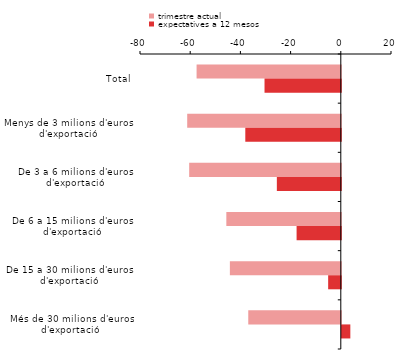
| Category | trimestre actual | expectatives a 12 mesos |
|---|---|---|
| Total | -57.457 | -30.39 |
| Menys de 3 milions d'euros d'exportació | -61.192 | -38.047 |
| De 3 a 6 milions d'euros d'exportació | -60.402 | -25.479 |
| De 6 a 15 milions d'euros d'exportació | -45.605 | -17.611 |
| De 15 a 30 milions d'euros d'exportació | -44.196 | -5.04 |
| Més de 30 milions d'euros d'exportació | -36.866 | 3.4 |